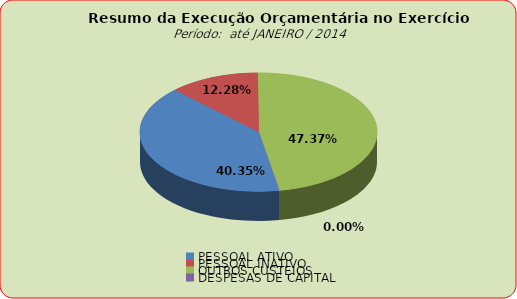
| Category | Series 0 |
|---|---|
| PESSOAL ATIVO | 10711158.94 |
| PESSOAL INATIVO | 3260480.47 |
| OUTROS CUSTEIOS | 12576308.87 |
| DESPESAS DE CAPITAL | 0 |